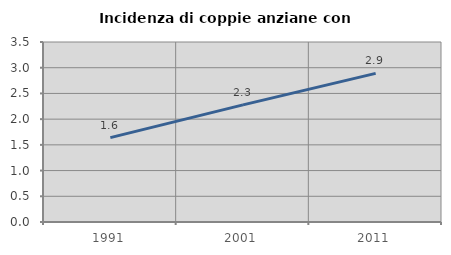
| Category | Incidenza di coppie anziane con figli |
|---|---|
| 1991.0 | 1.64 |
| 2001.0 | 2.277 |
| 2011.0 | 2.89 |